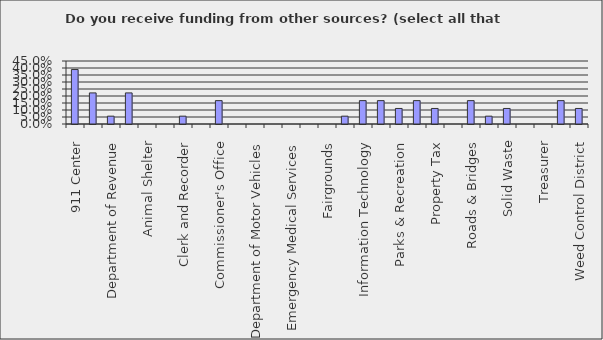
| Category | Series 0 |
|---|---|
| 911 Center | 0.389 |
| MLIAC | 0.222 |
| Department of Revenue | 0.056 |
| Local Cities | 0.222 |
| Animal Shelter | 0 |
| Auditor | 0 |
| Clerk and Recorder | 0.056 |
| Clerk of Court | 0 |
| Commissioner's Office | 0.167 |
| County Attorney | 0 |
| Department of Motor Vehicles | 0 |
| Election | 0 |
| Emergency Medical Services | 0 |
| Extension | 0 |
| Fairgrounds | 0 |
| Health Department | 0.056 |
| Information Technology | 0.167 |
| Office of Emergency Services (OES) | 0.167 |
| Parks & Recreation | 0.111 |
| Planning & Zoning | 0.167 |
| Property Tax | 0.111 |
| Plat Room Surveyor | 0 |
| Roads & Bridges | 0.167 |
| Sheriff's Office | 0.056 |
| Solid Waste | 0.111 |
| Superintendent of Schools | 0 |
| Treasurer | 0 |
| Utilities | 0.167 |
| Weed Control District | 0.111 |